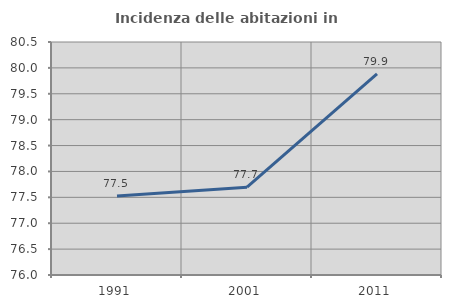
| Category | Incidenza delle abitazioni in proprietà  |
|---|---|
| 1991.0 | 77.527 |
| 2001.0 | 77.696 |
| 2011.0 | 79.887 |